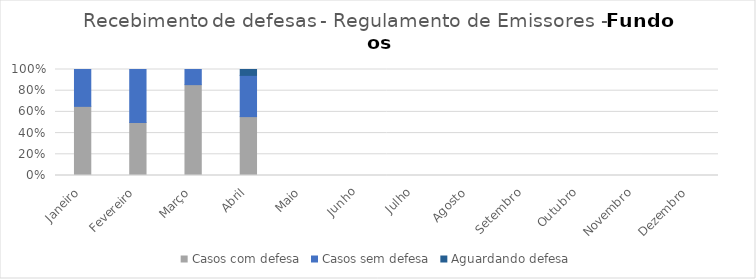
| Category | Casos com defesa | Casos sem defesa | Aguardando defesa |
|---|---|---|---|
| Janeiro | 15 | 8 | 0 |
| Fevereiro | 2 | 2 | 0 |
| Março | 6 | 1 | 0 |
| Abril | 10 | 7 | 1 |
| Maio | 0 | 0 | 0 |
| Junho | 0 | 0 | 0 |
| Julho | 0 | 0 | 0 |
| Agosto | 0 | 0 | 0 |
| Setembro | 0 | 0 | 0 |
| Outubro | 0 | 0 | 0 |
| Novembro | 0 | 0 | 0 |
| Dezembro | 0 | 0 | 0 |